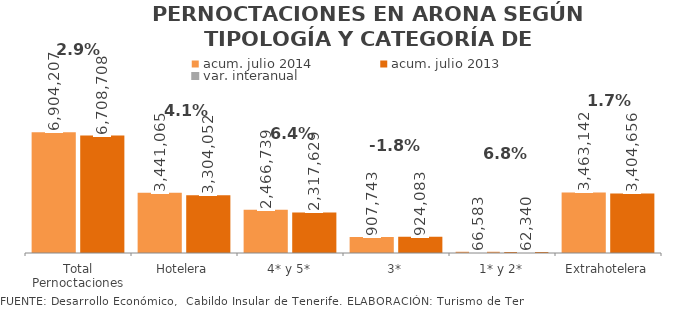
| Category | acum. julio 2014 | acum. julio 2013 |
|---|---|---|
| Total Pernoctaciones | 6904207 | 6708708 |
| Hotelera | 3441065 | 3304052 |
| 4* y 5* | 2466739 | 2317629 |
| 3* | 907743 | 924083 |
| 1* y 2* | 66583 | 62340 |
| Extrahotelera | 3463142 | 3404656 |